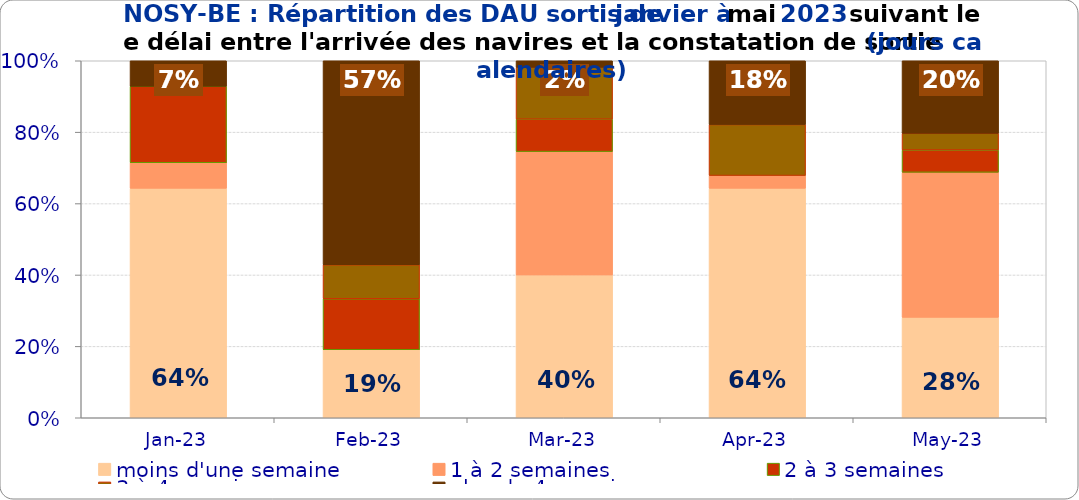
| Category | moins d'une semaine | 1 à 2 semaines | 2 à 3 semaines | 3 à 4 semaines | plus de 4 semaines |
|---|---|---|---|---|---|
| 2023-01-01 | 0.643 | 0.071 | 0.214 | 0 | 0.071 |
| 2023-02-01 | 0.19 | 0 | 0.143 | 0.095 | 0.571 |
| 2023-03-01 | 0.4 | 0.345 | 0.091 | 0.145 | 0.018 |
| 2023-04-01 | 0.643 | 0.036 | 0 | 0.143 | 0.179 |
| 2023-05-01 | 0.281 | 0.406 | 0.062 | 0.047 | 0.203 |